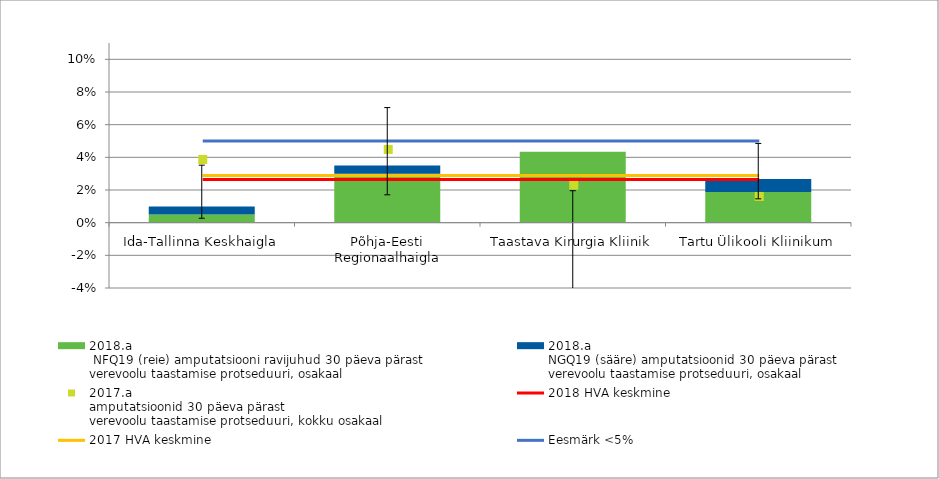
| Category | 2018.a 
 NFQ19 (reie) amputatsiooni ravijuhud 30 päeva pärast
verevoolu taastamise protseduuri, osakaal | 2018.a
NGQ19 (sääre) amputatsioonid 30 päeva pärast
verevoolu taastamise protseduuri, osakaal |
|---|---|---|
| Ida-Tallinna Keskhaigla | 0.005 | 0.005 |
| Põhja-Eesti Regionaalhaigla | 0.03 | 0.005 |
| Taastava Kirurgia Kliinik | 0.043 | 0 |
| Tartu Ülikooli Kliinikum | 0.019 | 0.008 |